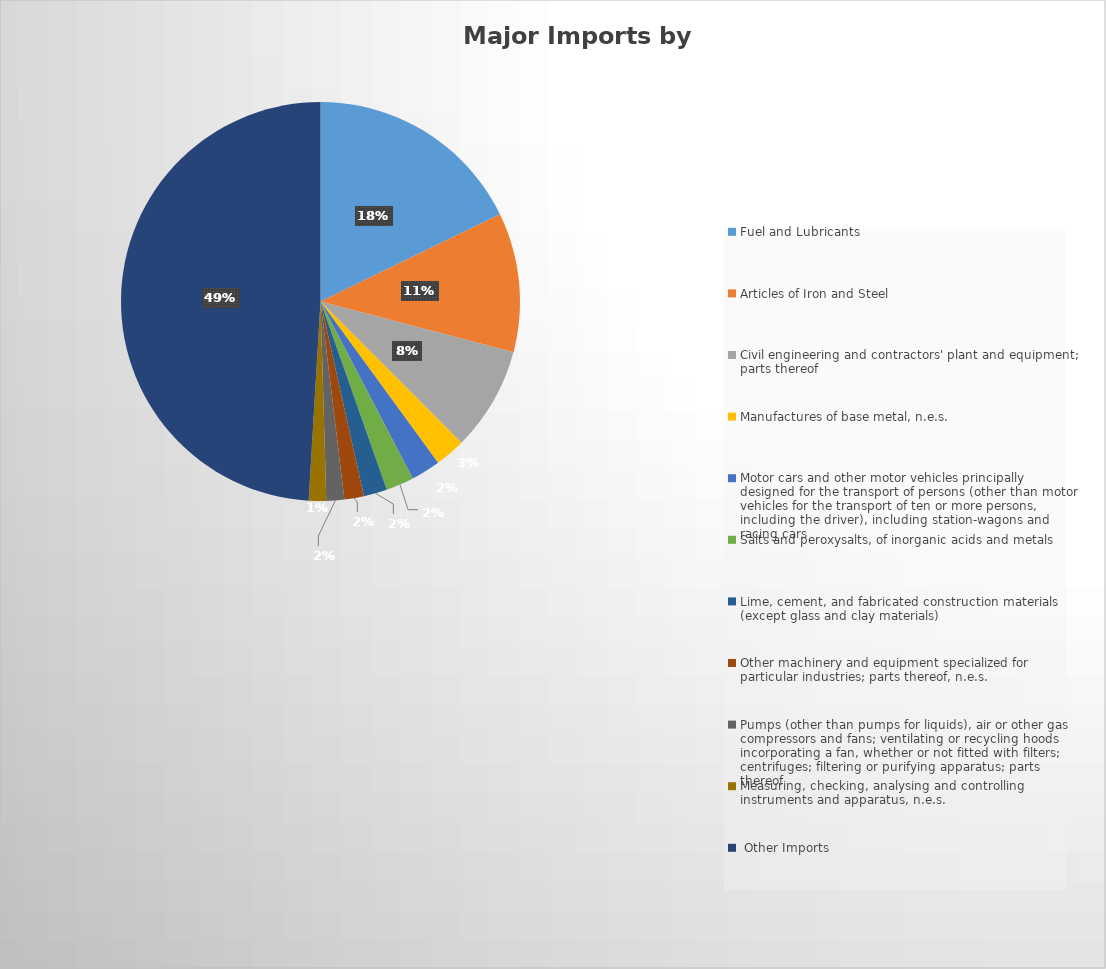
| Category | Series 0 |
|---|---|
| Fuel and Lubricants | 107976.5 |
| Articles of Iron and Steel | 68602.219 |
| Civil engineering and contractors' plant and equipment; parts thereof | 51101.998 |
| Manufactures of base metal, n.e.s. | 14923.658 |
| Motor cars and other motor vehicles principally designed for the transport of persons (other than motor vehicles for the transport of ten or more persons, including the driver), including station-wagons and racing cars | 14428.276 |
| Salts and peroxysalts, of inorganic acids and metals | 13711.345 |
| Lime, cement, and fabricated construction materials (except glass and clay materials) | 11510.633 |
| Other machinery and equipment specialized for particular industries; parts thereof, n.e.s. | 9600.842 |
| Pumps (other than pumps for liquids), air or other gas compressors and fans; ventilating or recycling hoods incorporating a fan, whether or not fitted with filters; centrifuges; filtering or purifying apparatus; parts thereof | 8797.553 |
| Measuring, checking, analysing and controlling instruments and apparatus, n.e.s. | 8548.558 |
| Other Imports | 297725.549 |